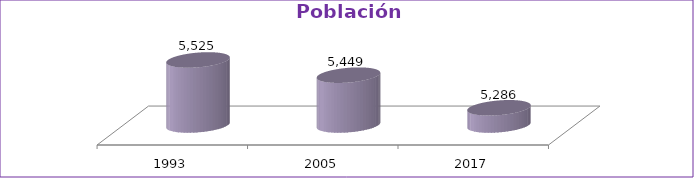
| Category | Población Total |
|---|---|
| 1993 | 5525 |
| 2005 | 5449 |
| 2017 | 5286 |